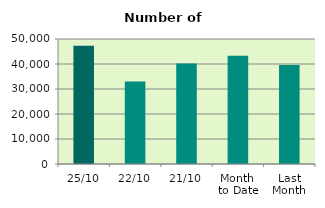
| Category | Series 0 |
|---|---|
| 25/10 | 47300 |
| 22/10 | 33032 |
| 21/10 | 40174 |
| Month 
to Date | 43283.294 |
| Last
Month | 39557.091 |